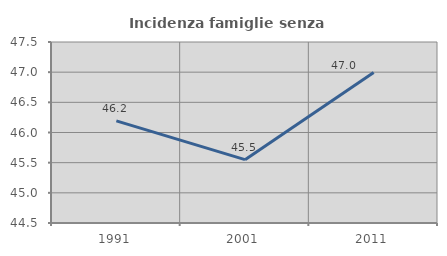
| Category | Incidenza famiglie senza nuclei |
|---|---|
| 1991.0 | 46.193 |
| 2001.0 | 45.55 |
| 2011.0 | 46.995 |